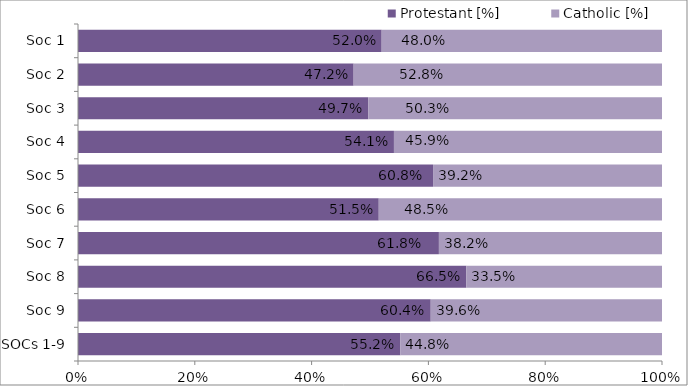
| Category | Protestant | Catholic |
|---|---|---|
| SOCs 1-9 | 0.552 | 0.448 |
| Soc 9 | 0.604 | 0.396 |
| Soc 8 | 0.665 | 0.335 |
| Soc 7 | 0.618 | 0.382 |
| Soc 6 | 0.515 | 0.485 |
| Soc 5 | 0.608 | 0.392 |
| Soc 4 | 0.541 | 0.459 |
| Soc 3 | 0.497 | 0.503 |
| Soc 2 | 0.472 | 0.528 |
| Soc 1 | 0.52 | 0.48 |